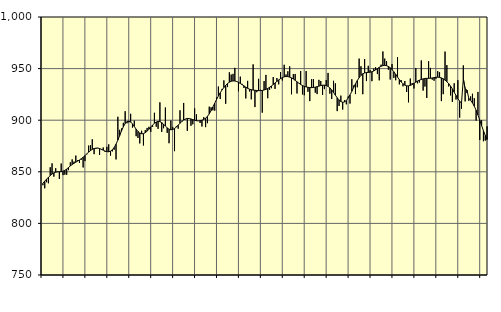
| Category | Piggar | Series 1 |
|---|---|---|
| nan | 837 | 838.9 |
| 1.0 | 834 | 840.96 |
| 1.0 | 839.9 | 842.87 |
| 1.0 | 838.9 | 844.65 |
| 1.0 | 854.4 | 846.36 |
| 1.0 | 858.2 | 847.87 |
| 1.0 | 845.3 | 848.96 |
| 1.0 | 853.5 | 849.65 |
| 1.0 | 850.2 | 849.94 |
| 1.0 | 843.1 | 850.06 |
| 1.0 | 858 | 850.23 |
| 1.0 | 846.8 | 850.65 |
| nan | 847.2 | 851.45 |
| 2.0 | 847.1 | 852.67 |
| 2.0 | 851.6 | 854.14 |
| 2.0 | 859.2 | 855.68 |
| 2.0 | 862 | 857.07 |
| 2.0 | 859.9 | 858.26 |
| 2.0 | 865.7 | 859.32 |
| 2.0 | 861.2 | 860.35 |
| 2.0 | 858.5 | 861.45 |
| 2.0 | 861.7 | 862.71 |
| 2.0 | 854.2 | 864.14 |
| 2.0 | 860.4 | 865.7 |
| nan | 866.9 | 867.37 |
| 3.0 | 875.4 | 869.02 |
| 3.0 | 875.8 | 870.52 |
| 3.0 | 881.5 | 871.74 |
| 3.0 | 867.1 | 872.55 |
| 3.0 | 872.2 | 872.94 |
| 3.0 | 873.2 | 872.95 |
| 3.0 | 866.4 | 872.54 |
| 3.0 | 871.2 | 871.82 |
| 3.0 | 873.6 | 870.94 |
| 3.0 | 869.3 | 870.08 |
| 3.0 | 874.2 | 869.51 |
| nan | 876.6 | 869.43 |
| 4.0 | 865.7 | 869.99 |
| 4.0 | 869.8 | 871.36 |
| 4.0 | 871.4 | 873.59 |
| 4.0 | 862 | 876.74 |
| 4.0 | 903.3 | 880.7 |
| 4.0 | 890.7 | 885.12 |
| 4.0 | 892 | 889.56 |
| 4.0 | 897.5 | 893.59 |
| 4.0 | 908.7 | 896.74 |
| 4.0 | 897 | 898.63 |
| 4.0 | 897.9 | 899.1 |
| nan | 906.2 | 898.25 |
| 5.0 | 892.8 | 896.38 |
| 5.0 | 899.6 | 893.91 |
| 5.0 | 884.5 | 891.32 |
| 5.0 | 882.8 | 889.13 |
| 5.0 | 877.5 | 887.59 |
| 5.0 | 889.8 | 886.86 |
| 5.0 | 875.5 | 887.01 |
| 5.0 | 890.4 | 887.88 |
| 5.0 | 892.5 | 889.34 |
| 5.0 | 893.6 | 891.27 |
| 5.0 | 888.7 | 893.39 |
| nan | 893.5 | 895.38 |
| 6.0 | 907.2 | 897.06 |
| 6.0 | 893.7 | 898.25 |
| 6.0 | 891.6 | 898.79 |
| 6.0 | 917.3 | 898.6 |
| 6.0 | 888.7 | 897.68 |
| 6.0 | 892.2 | 896.13 |
| 6.0 | 912.3 | 894.28 |
| 6.0 | 887.7 | 892.57 |
| 6.0 | 877.7 | 891.29 |
| 6.0 | 899.7 | 890.71 |
| 6.0 | 893.5 | 890.95 |
| nan | 870 | 891.92 |
| 7.0 | 894.2 | 893.39 |
| 7.0 | 891.8 | 895.15 |
| 7.0 | 909.6 | 897.02 |
| 7.0 | 899.4 | 898.79 |
| 7.0 | 916.7 | 900.19 |
| 7.0 | 900.9 | 901.18 |
| 7.0 | 889.7 | 901.67 |
| 7.0 | 901.7 | 901.61 |
| 7.0 | 894.6 | 901.2 |
| 7.0 | 896 | 900.57 |
| 7.0 | 911.4 | 899.92 |
| nan | 905.6 | 899.49 |
| 8.0 | 899.3 | 899.35 |
| 8.0 | 897.4 | 899.5 |
| 8.0 | 893.9 | 899.96 |
| 8.0 | 902.9 | 900.75 |
| 8.0 | 893.3 | 901.95 |
| 8.0 | 897.1 | 903.68 |
| 8.0 | 913.1 | 906.1 |
| 8.0 | 912.5 | 909.22 |
| 8.0 | 909.6 | 912.77 |
| 8.0 | 909.2 | 916.48 |
| 8.0 | 921.9 | 920.09 |
| nan | 932.6 | 923.45 |
| 9.0 | 920.5 | 926.51 |
| 9.0 | 930.3 | 929.25 |
| 9.0 | 938.6 | 931.67 |
| 9.0 | 915.9 | 933.79 |
| 9.0 | 932.1 | 935.52 |
| 9.0 | 946.4 | 936.84 |
| 9.0 | 944.2 | 937.75 |
| 9.0 | 944.9 | 938.07 |
| 9.0 | 950.7 | 937.96 |
| 9.0 | 937.7 | 937.51 |
| 9.0 | 928 | 936.72 |
| nan | 942.2 | 935.61 |
| 10.0 | 935.2 | 934.42 |
| 10.0 | 931.2 | 933.25 |
| 10.0 | 921.1 | 932.05 |
| 10.0 | 938.1 | 930.94 |
| 10.0 | 927.9 | 930.08 |
| 10.0 | 920.2 | 929.51 |
| 10.0 | 954.1 | 929.16 |
| 10.0 | 912.7 | 928.96 |
| 10.0 | 927.1 | 928.79 |
| 10.0 | 940.1 | 928.68 |
| 10.0 | 929.4 | 928.7 |
| nan | 907.3 | 928.87 |
| 11.0 | 937.9 | 929.24 |
| 11.0 | 943.9 | 929.88 |
| 11.0 | 921.3 | 930.77 |
| 11.0 | 929.5 | 931.85 |
| 11.0 | 931 | 933.13 |
| 11.0 | 941.8 | 934.58 |
| 11.0 | 930.3 | 936.07 |
| 11.0 | 940.9 | 937.55 |
| 11.0 | 934.7 | 939.04 |
| 11.0 | 946.6 | 940.29 |
| 11.0 | 938.5 | 941.26 |
| nan | 953.7 | 942.01 |
| 12.0 | 944.3 | 942.38 |
| 12.0 | 947.4 | 942.25 |
| 12.0 | 952.2 | 941.75 |
| 12.0 | 925.1 | 940.98 |
| 12.0 | 944.7 | 939.89 |
| 12.0 | 944.8 | 938.59 |
| 12.0 | 925.9 | 937.22 |
| 12.0 | 936.1 | 935.88 |
| 12.0 | 947.7 | 934.63 |
| 12.0 | 925 | 933.58 |
| 12.0 | 924.2 | 932.79 |
| nan | 947.6 | 932.26 |
| 13.0 | 927.5 | 931.88 |
| 13.0 | 918.5 | 931.63 |
| 13.0 | 939.7 | 931.59 |
| 13.0 | 939.9 | 931.74 |
| 13.0 | 926.7 | 932.05 |
| 13.0 | 925.3 | 932.47 |
| 13.0 | 939.1 | 933.01 |
| 13.0 | 938 | 933.56 |
| 13.0 | 924.5 | 933.94 |
| 13.0 | 930.1 | 933.98 |
| 13.0 | 938.9 | 933.64 |
| nan | 945.8 | 932.75 |
| 14.0 | 925.7 | 931.29 |
| 14.0 | 920.6 | 929.3 |
| 14.0 | 938.2 | 926.89 |
| 14.0 | 935.7 | 924.25 |
| 14.0 | 908.8 | 921.75 |
| 14.0 | 913.8 | 919.62 |
| 14.0 | 923.8 | 918.06 |
| 14.0 | 910.3 | 917.37 |
| 14.0 | 919.4 | 917.71 |
| 14.0 | 915.4 | 919.14 |
| 14.0 | 922.9 | 921.47 |
| nan | 916.1 | 924.47 |
| 15.0 | 939.7 | 927.96 |
| 15.0 | 933.6 | 931.68 |
| 15.0 | 925.3 | 935.27 |
| 15.0 | 931.9 | 938.45 |
| 15.0 | 959.7 | 941.18 |
| 15.0 | 952.3 | 943.41 |
| 15.0 | 925.2 | 944.95 |
| 15.0 | 959.3 | 945.8 |
| 15.0 | 937.9 | 946.17 |
| 15.0 | 952.7 | 946.3 |
| 15.0 | 948.5 | 946.5 |
| nan | 937.8 | 946.93 |
| 16.0 | 950.1 | 947.69 |
| 16.0 | 951.3 | 948.75 |
| 16.0 | 944.7 | 949.99 |
| 16.0 | 938.6 | 951.24 |
| 16.0 | 953.8 | 952.26 |
| 16.0 | 966.6 | 952.89 |
| 16.0 | 959.7 | 953.09 |
| 16.0 | 957.2 | 952.85 |
| 16.0 | 948.9 | 952.1 |
| 16.0 | 939.4 | 950.85 |
| 16.0 | 954.4 | 949.06 |
| nan | 941 | 946.89 |
| 17.0 | 938.7 | 944.41 |
| 17.0 | 961 | 941.8 |
| 17.0 | 934.7 | 939.31 |
| 17.0 | 938.9 | 937.07 |
| 17.0 | 932.8 | 935.26 |
| 17.0 | 938 | 933.96 |
| 17.0 | 927.3 | 933.31 |
| 17.0 | 917.3 | 933.26 |
| 17.0 | 940.4 | 933.69 |
| 17.0 | 936 | 934.53 |
| 17.0 | 930.7 | 935.65 |
| nan | 950.6 | 936.84 |
| 18.0 | 935.7 | 937.96 |
| 18.0 | 936.6 | 938.82 |
| 18.0 | 957.9 | 939.46 |
| 18.0 | 928.7 | 940.05 |
| 18.0 | 932.6 | 940.44 |
| 18.0 | 921.5 | 940.57 |
| 18.0 | 957.1 | 940.57 |
| 18.0 | 950.7 | 940.66 |
| 18.0 | 939.3 | 940.95 |
| 18.0 | 938.2 | 941.29 |
| 18.0 | 940.1 | 941.61 |
| nan | 947.5 | 941.7 |
| 19.0 | 946.5 | 941.49 |
| 19.0 | 918.5 | 941.01 |
| 19.0 | 925.2 | 940.11 |
| 19.0 | 966.5 | 938.84 |
| 19.0 | 953.4 | 937.3 |
| 19.0 | 932.7 | 935.43 |
| 19.0 | 924 | 933.13 |
| 19.0 | 917.7 | 930.31 |
| 19.0 | 935.8 | 927.15 |
| 19.0 | 920 | 924.01 |
| 19.0 | 938.8 | 921 |
| nan | 902.5 | 918.43 |
| 20.0 | 911.1 | 916.41 |
| 20.0 | 953.1 | 940.16 |
| 20.0 | 918.2 | 930.21 |
| 20.0 | 926.3 | 929.25 |
| 20.0 | 918.8 | 921.18 |
| 20.0 | 923.1 | 919.28 |
| 20.0 | 925.6 | 916.77 |
| 20.0 | 921.3 | 913.58 |
| 20.0 | 899.6 | 909.67 |
| 20.0 | 927.4 | 905.06 |
| 20.0 | 880.8 | 900.02 |
| nan | 899.9 | 894.84 |
| 21.0 | 879.6 | 889.86 |
| 21.0 | 880.2 | 885.25 |
| 21.0 | 894.1 | 881.16 |